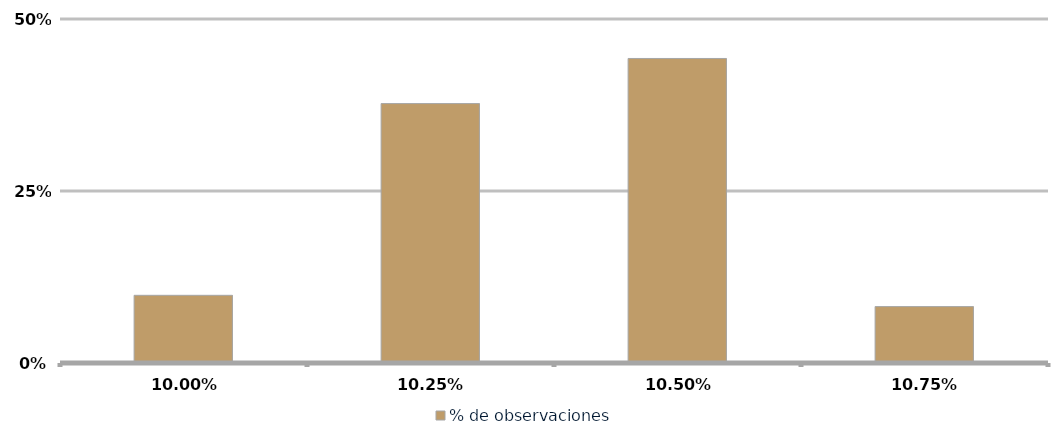
| Category | % de observaciones  |
|---|---|
| 0.09999999999999999 | 0.098 |
| 0.1025 | 0.377 |
| 0.105 | 0.443 |
| 0.1075 | 0.082 |